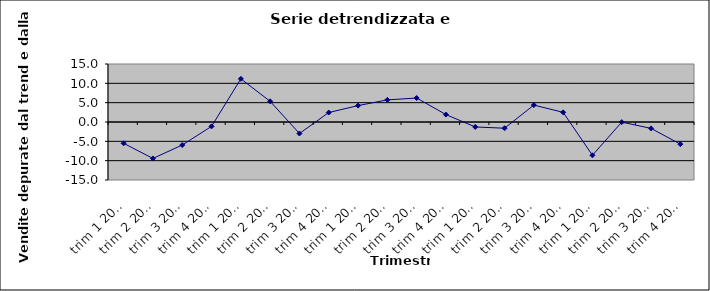
| Category | Serie detrendizzata |
|---|---|
| trim 1 2017 | -5.51 |
| trim 2 2017 | -9.43 |
| trim 3 2017 | -5.95 |
| trim 4 2017 | -1.13 |
| trim 1 2018 | 11.165 |
| trim 2 2018 | 5.345 |
| trim 3 2018 | -2.975 |
| trim 4 2018 | 2.445 |
| trim 1 2019 | 4.24 |
| trim 2 2019 | 5.72 |
| trim 3 2019 | 6.2 |
| trim 4 2019 | 1.92 |
| trim 1 2020 | -1.285 |
| trim 2 2020 | -1.605 |
| trim 3 2020 | 4.375 |
| trim 4 2020 | 2.495 |
| trim 1 2021 | -8.61 |
| trim 2 2021 | -0.03 |
| trim 3 2021 | -1.65 |
| trim 4 2021 | -5.73 |